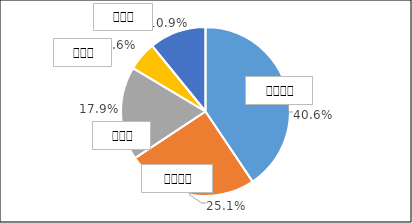
| Category | Series 0 |
|---|---|
| 0 | 0.406 |
| 1 | 0.251 |
| 2 | 0.179 |
| 3 | 0.056 |
| 4 | 0.109 |